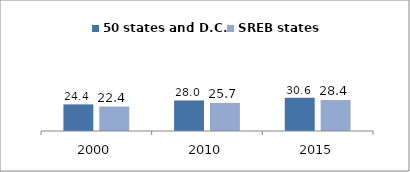
| Category | 50 states and D.C. | SREB states |
|---|---|---|
| 2000.0 | 24.402 | 22.445 |
| 2010.0 | 28.007 | 25.685 |
| 2015.0 | 30.604 | 28.382 |